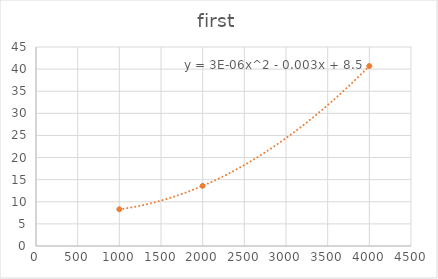
| Category | second |
|---|---|
| 1000.0 | 8.3 |
| 4000.0 | 40.7 |
| 2000.0 | 13.6 |